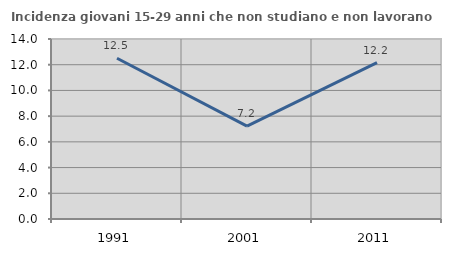
| Category | Incidenza giovani 15-29 anni che non studiano e non lavorano  |
|---|---|
| 1991.0 | 12.5 |
| 2001.0 | 7.229 |
| 2011.0 | 12.169 |